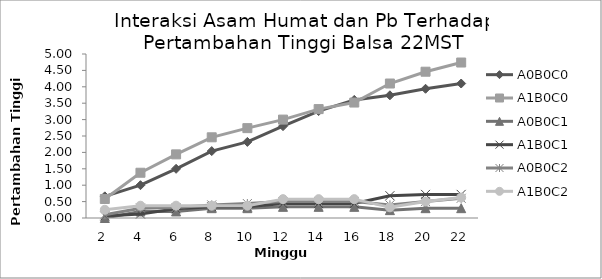
| Category | A0B0C0 | A1B0C0 | A0B0C1 | A1B0C1 | A0B0C2 | A1B0C2 |
|---|---|---|---|---|---|---|
| 2.0 | 0.66 | 0.58 | 0 | 0.06 | 0.1 | 0.25 |
| 4.0 | 1 | 1.38 | 0.2 | 0.12 | 0.3 | 0.375 |
| 6.0 | 1.5 | 1.94 | 0.2 | 0.28 | 0.32 | 0.375 |
| 8.0 | 2.04 | 2.46 | 0.3 | 0.34 | 0.4 | 0.375 |
| 10.0 | 2.32 | 2.74 | 0.3 | 0.34 | 0.44 | 0.375 |
| 12.0 | 2.8 | 3 | 0.34 | 0.44 | 0.5 | 0.575 |
| 14.0 | 3.26 | 3.32 | 0.34 | 0.44 | 0.5 | 0.575 |
| 16.0 | 3.6 | 3.52 | 0.34 | 0.44 | 0.5 | 0.575 |
| 18.0 | 3.74 | 4.1 | 0.24 | 0.68 | 0.4 | 0.325 |
| 20.0 | 3.94 | 4.46 | 0.3 | 0.72 | 0.5 | 0.5 |
| 22.0 | 4.1 | 4.74 | 0.3 | 0.72 | 0.6 | 0.625 |